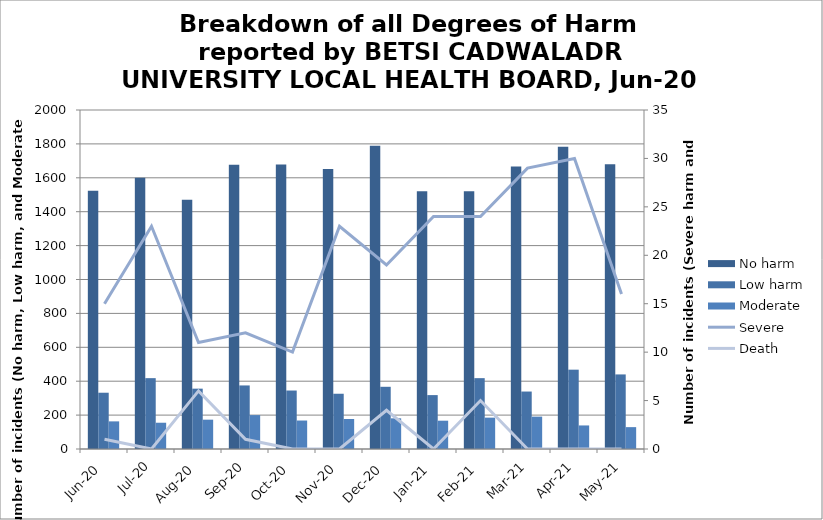
| Category | No harm | Low harm | Moderate |
|---|---|---|---|
| Jun-20 | 1523 | 332 | 163 |
| Jul-20 | 1600 | 418 | 155 |
| Aug-20 | 1471 | 356 | 173 |
| Sep-20 | 1677 | 375 | 200 |
| Oct-20 | 1679 | 345 | 168 |
| Nov-20 | 1652 | 326 | 177 |
| Dec-20 | 1789 | 367 | 181 |
| Jan-21 | 1521 | 318 | 167 |
| Feb-21 | 1520 | 418 | 185 |
| Mar-21 | 1667 | 339 | 191 |
| Apr-21 | 1783 | 468 | 139 |
| May-21 | 1680 | 440 | 129 |